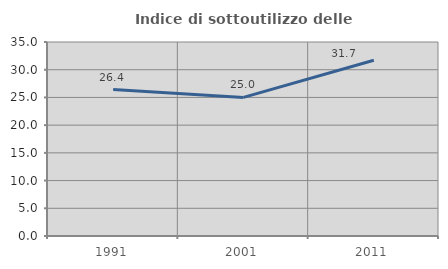
| Category | Indice di sottoutilizzo delle abitazioni  |
|---|---|
| 1991.0 | 26.415 |
| 2001.0 | 25 |
| 2011.0 | 31.707 |